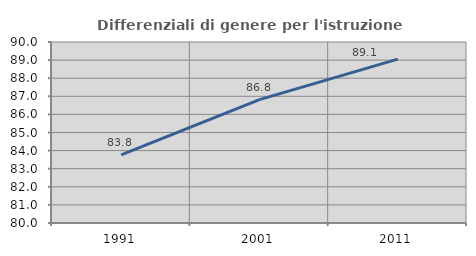
| Category | Differenziali di genere per l'istruzione superiore |
|---|---|
| 1991.0 | 83.764 |
| 2001.0 | 86.815 |
| 2011.0 | 89.057 |